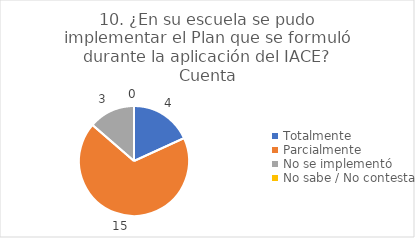
| Category | 10. ¿En su escuela se pudo implementar el Plan que se formuló durante la aplicación del IACE? |
|---|---|
| Totalmente  | 0.182 |
| Parcialmente  | 0.682 |
| No se implementó  | 0.136 |
| No sabe / No contesta | 0 |